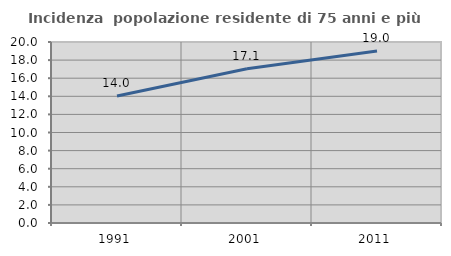
| Category | Incidenza  popolazione residente di 75 anni e più |
|---|---|
| 1991.0 | 14.035 |
| 2001.0 | 17.054 |
| 2011.0 | 19.008 |